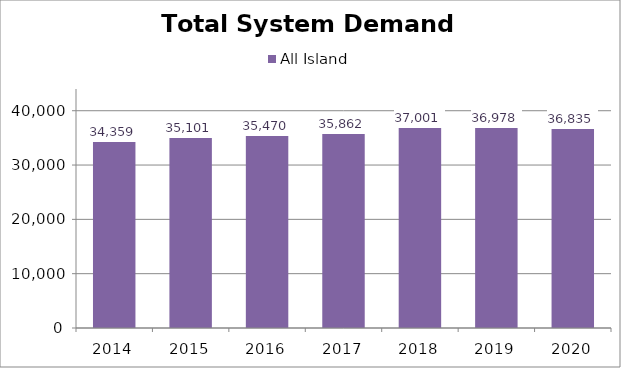
| Category | All Island |
|---|---|
| 2014.0 | 34358.582 |
| 2015.0 | 35100.52 |
| 2016.0 | 35469.562 |
| 2017.0 | 35861.998 |
| 2018.0 | 37000.563 |
| 2019.0 | 36978.326 |
| 2020.0 | 36835.379 |